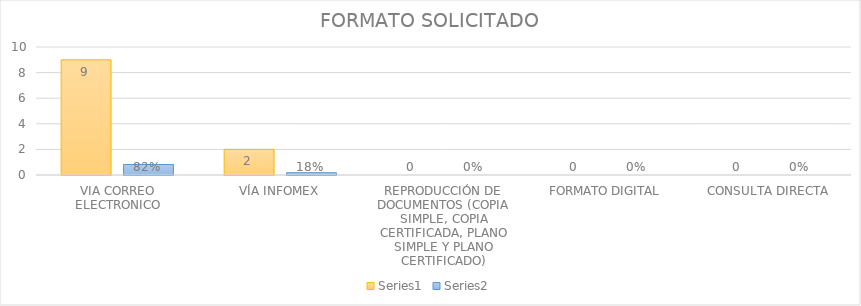
| Category | Series 3 | Series 4 |
|---|---|---|
| VIA CORREO ELECTRONICO | 9 | 0.818 |
| VÍA INFOMEX | 2 | 0.182 |
| REPRODUCCIÓN DE DOCUMENTOS (COPIA SIMPLE, COPIA CERTIFICADA, PLANO SIMPLE Y PLANO CERTIFICADO) | 0 | 0 |
| FORMATO DIGITAL | 0 | 0 |
| CONSULTA DIRECTA | 0 | 0 |